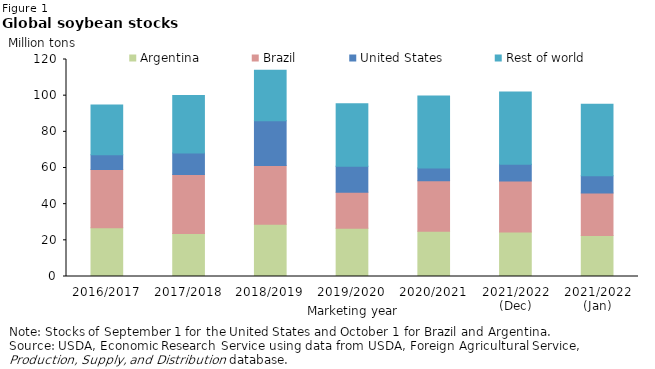
| Category | Argentina | Brazil | United States | Rest of world |
|---|---|---|---|---|
| 2016/2017 | 26.996 | 32.112 | 8.208 | 27.555 |
| 2017/2018 | 23.734 | 32.696 | 11.923 | 31.723 |
| 2018/2019 | 28.89 | 32.472 | 24.74 | 27.985 |
| 2019/2020 | 26.65 | 20 | 14.276 | 34.669 |
| 2020/2021 | 25.06 | 27.954 | 6.994 | 39.872 |
| 2021/2022 (Dec) | 24.61 | 28.25 | 9.251 | 39.89 |
| 2021/2022 (Jan) | 22.61 | 23.554 | 9.524 | 39.516 |